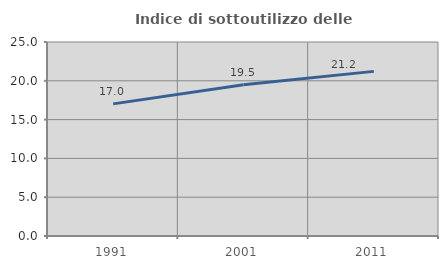
| Category | Indice di sottoutilizzo delle abitazioni  |
|---|---|
| 1991.0 | 17.025 |
| 2001.0 | 19.482 |
| 2011.0 | 21.214 |